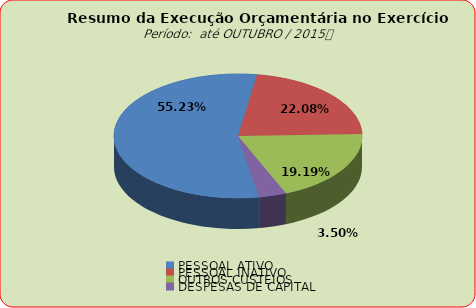
| Category | Series 0 |
|---|---|
| PESSOAL ATIVO | 102893835.45 |
| PESSOAL INATIVO | 41134940.14 |
| OUTROS CUSTEIOS | 35745747.76 |
| DESPESAS DE CAPITAL | 6513702.59 |